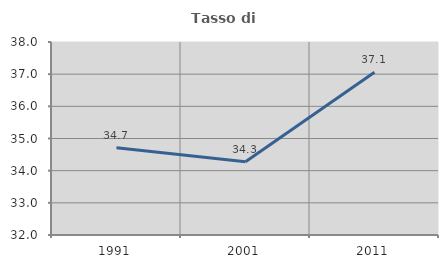
| Category | Tasso di occupazione   |
|---|---|
| 1991.0 | 34.715 |
| 2001.0 | 34.275 |
| 2011.0 | 37.058 |